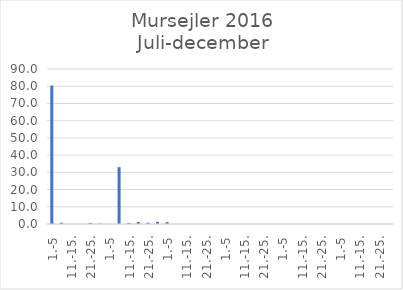
| Category | Series 0 |
|---|---|
| 1.-5 | 80.405 |
| 6.-10. | 0.751 |
| 11.-15. | 0 |
| 16.-20. | 0 |
| 21.-25. | 0.619 |
| 26.-31. | 0.251 |
| 1.-5 | 0 |
| 6.-10. | 33.016 |
| 11.-15. | 0.608 |
| 16.-20. | 1.125 |
| 21.-25. | 0.742 |
| 26.-31. | 1.251 |
| 1.-5 | 1.084 |
| 6.-10. | 0.07 |
| 11.-15. | 0 |
| 16.-20. | 0 |
| 21.-25. | 0 |
| 26.-30. | 0 |
| 1.-5 | 0.018 |
| 6.-10. | 0 |
| 11.-15. | 0 |
| 16.-20. | 0 |
| 21.-25. | 0 |
| 26.-31. | 0 |
| 1.-5 | 0 |
| 6.-10. | 0 |
| 11.-15. | 0 |
| 16.-20. | 0 |
| 21.-25. | 0 |
| 26.-30. | 0 |
| 1.-5 | 0 |
| 6.-10. | 0 |
| 11.-15. | 0 |
| 16.-20. | 0 |
| 21.-25. | 0 |
| 26.-31. | 0 |